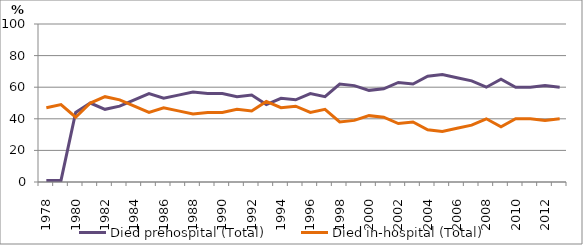
| Category | Died prehospital (Total) | Died in-hospital (Total) |
|---|---|---|
| 1978.0 | 1 | 47 |
| 1979.0 | 1 | 49 |
| 1980.0 | 44 | 41 |
| 1981.0 | 50 | 50 |
| 1982.0 | 46 | 54 |
| 1983.0 | 48 | 52 |
| 1984.0 | 52 | 48 |
| 1985.0 | 56 | 44 |
| 1986.0 | 53 | 47 |
| 1987.0 | 55 | 45 |
| 1988.0 | 57 | 43 |
| 1989.0 | 56 | 44 |
| 1990.0 | 56 | 44 |
| 1991.0 | 54 | 46 |
| 1992.0 | 55 | 45 |
| 1993.0 | 49 | 51 |
| 1994.0 | 53 | 47 |
| 1995.0 | 52 | 48 |
| 1996.0 | 56 | 44 |
| 1997.0 | 54 | 46 |
| 1998.0 | 62 | 38 |
| 1999.0 | 61 | 39 |
| 2000.0 | 58 | 42 |
| 2001.0 | 59 | 41 |
| 2002.0 | 63 | 37 |
| 2003.0 | 62 | 38 |
| 2004.0 | 67 | 33 |
| 2005.0 | 68 | 32 |
| 2006.0 | 66 | 34 |
| 2007.0 | 64 | 36 |
| 2008.0 | 60 | 40 |
| 2009.0 | 65 | 35 |
| 2010.0 | 60 | 40 |
| 2011.0 | 60 | 40 |
| 2012.0 | 61 | 39 |
| 2013.0 | 60 | 40 |